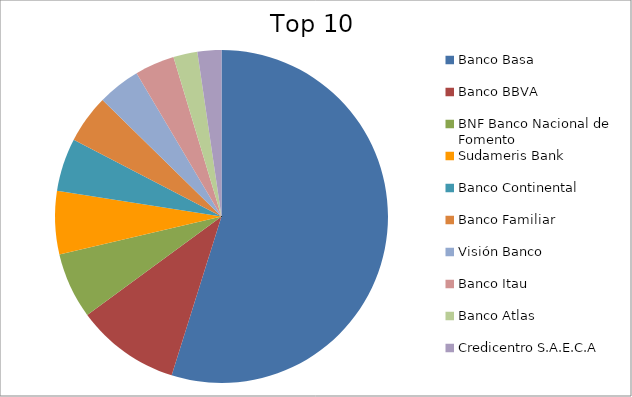
| Category | Series 0 |
|---|---|
| Banco Basa | 54.84 |
| Banco BBVA | 10.09 |
| BNF Banco Nacional de Fomento | 6.41 |
| Sudameris Bank | 6.13 |
| Banco Continental | 5.15 |
| Banco Familiar | 4.71 |
| Visión Banco | 4.15 |
| Banco Itau | 3.86 |
| Banco Atlas | 2.34 |
| Credicentro S.A.E.C.A | 2.32 |